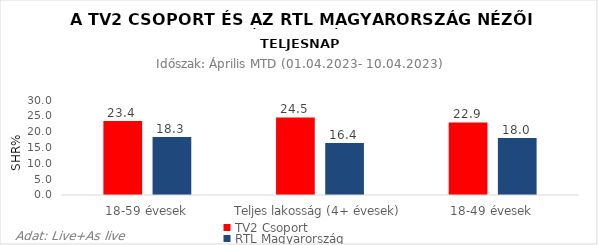
| Category | TV2 Csoport | RTL Magyarország |
|---|---|---|
| 18-59 évesek | 23.4 | 18.3 |
| Teljes lakosság (4+ évesek) | 24.5 | 16.4 |
| 18-49 évesek | 22.9 | 18 |